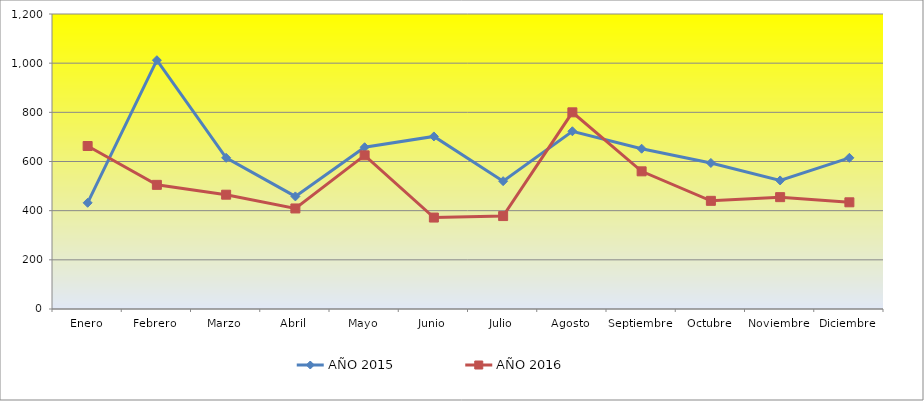
| Category | AÑO 2015 | AÑO 2016 |
|---|---|---|
| Enero | 432 | 663 |
| Febrero | 1012 | 505 |
| Marzo | 615 | 465 |
| Abril | 458 | 409 |
| Mayo | 658 | 625 |
| Junio | 702 | 372 |
| Julio | 520 | 378 |
| Agosto | 723 | 800 |
| Septiembre | 652 | 560 |
| Octubre | 594 | 440 |
| Noviembre | 523 | 455 |
| Diciembre | 615 | 434 |